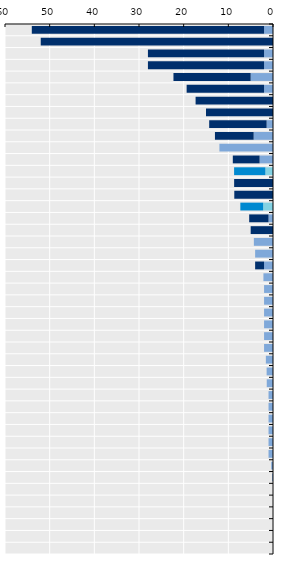
| Category | Series 0 | Series 1 |
|---|---|---|
| Korea | 2 | 52 |
| Japan | 0 | 52 |
| Luxembourg | 2 | 26 |
| France | 2 | 26 |
| Portugal | 5 | 17.286 |
| Belgium | 2 | 17.333 |
| Iceland | 0 | 17.33 |
| Norway | 0 | 15 |
| Sweden | 1.429 | 12.857 |
| Austria | 4.33 | 8.667 |
| Spain | 12 | 0 |
| Finland | 3 | 6 |
| OECD average | 1.707 | 7.005 |
| Germany | 0 | 8.7 |
| Croatia | 0 | 8.667 |
| EU average | 2.208 | 5.105 |
| Romania | 1 | 4.333 |
| Canada | 0 | 5 |
| Slovenia | 4.286 | 0 |
| Lithuania | 4 | 0 |
| Ireland | 2 | 2 |
| Bulgaria | 2.143 | 0 |
| Estonia | 2 | 0 |
| Poland | 2 | 0 |
| Cyprus | 2 | 0 |
| Denmark | 2 | 0 |
| Australia | 2 | 0 |
| United Kingdom | 2 | 0 |
| Colombia | 1.6 | 0 |
| Latvia | 1.429 | 0 |
| Italy | 1.4 | 0 |
| Hungary | 1 | 0 |
| Netherlands | 1 | 0 |
| Turkey | 1 | 0 |
| Mexico | 1 | 0 |
| Czech Republic | 1 | 0 |
| Chile | 1 | 0 |
| Greece | 0.4 | 0 |
| Malta | 0.2 | 0 |
| Slovak Republic | 0 | 0 |
| New Zealand | 0 | 0 |
| Costa Rica | 0 | 0 |
| Israel | 0 | 0 |
| Switzerland | 0 | 0 |